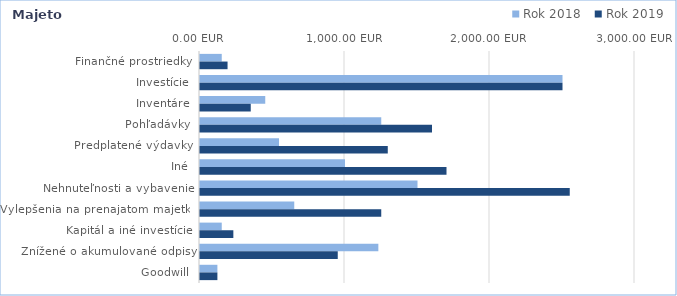
| Category | Rok 2018 | Rok 2019 |
|---|---|---|
| Finančné prostriedky | 150 | 190 |
| Investície | 2500 | 2500 |
| Inventáre | 450 | 350 |
| Pohľadávky | 1250 | 1600 |
| Predplatené výdavky | 545 | 1295 |
| Iné | 1000 | 1700 |
| Nehnuteľnosti a vybavenie | 1500 | 2550 |
| Vylepšenia na prenajatom majetku | 650 | 1250 |
| Kapitál a iné investície | 150 | 230 |
| Znížené o akumulované odpisy | 1230 | 950 |
| Goodwill | 120 | 120 |